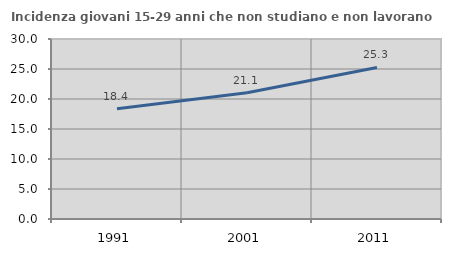
| Category | Incidenza giovani 15-29 anni che non studiano e non lavorano  |
|---|---|
| 1991.0 | 18.359 |
| 2001.0 | 21.053 |
| 2011.0 | 25.263 |